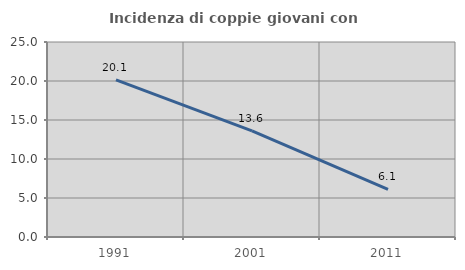
| Category | Incidenza di coppie giovani con figli |
|---|---|
| 1991.0 | 20.134 |
| 2001.0 | 13.605 |
| 2011.0 | 6.107 |